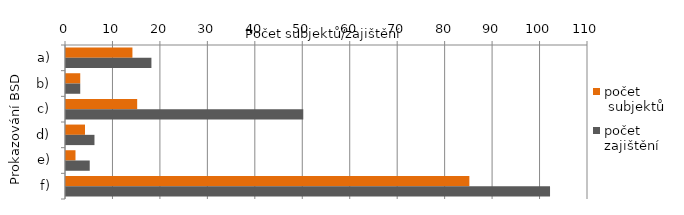
| Category | počet
 subjektů | počet
zajištění |
|---|---|---|
| a) | 14 | 18 |
| b) | 3 | 3 |
| c) | 15 | 50 |
| d) | 4 | 6 |
| e) | 2 | 5 |
| f) | 85 | 102 |